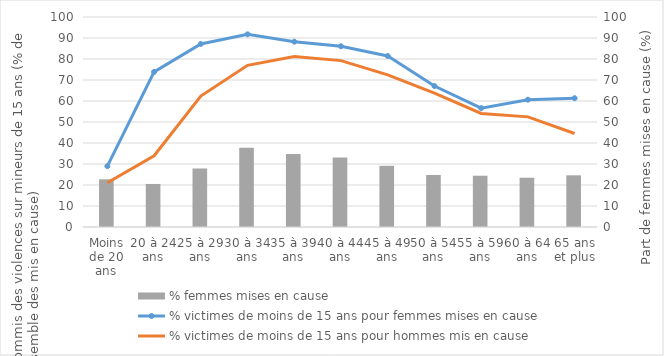
| Category | % femmes mises en cause |
|---|---|
| Moins de 20 ans | 22.711 |
| 20 à 24 ans | 20.496 |
| 25 à 29 ans | 27.857 |
| 30 à 34 ans | 37.776 |
| 35 à 39 ans | 34.805 |
| 40 à 44 ans | 33.05 |
| 45 à 49 ans | 29.139 |
| 50 à 54 ans | 24.778 |
| 55 à 59 ans | 24.419 |
| 60 à 64 ans | 23.469 |
| 65 ans et plus | 24.615 |